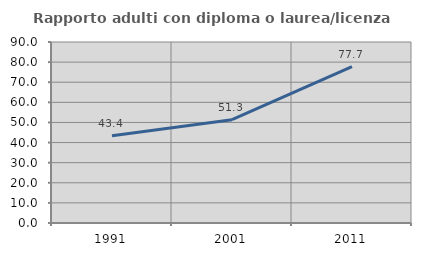
| Category | Rapporto adulti con diploma o laurea/licenza media  |
|---|---|
| 1991.0 | 43.351 |
| 2001.0 | 51.349 |
| 2011.0 | 77.744 |